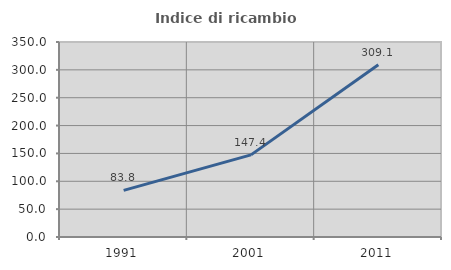
| Category | Indice di ricambio occupazionale  |
|---|---|
| 1991.0 | 83.75 |
| 2001.0 | 147.368 |
| 2011.0 | 309.091 |